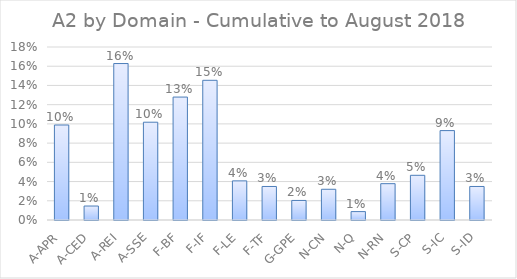
| Category | Series 0 |
|---|---|
| A-APR | 0.099 |
| A-CED | 0.015 |
| A-REI | 0.163 |
| A-SSE | 0.102 |
| F-BF | 0.128 |
| F-IF | 0.145 |
| F-LE | 0.041 |
| F-TF | 0.035 |
| G-GPE | 0.02 |
| N-CN | 0.032 |
| N-Q | 0.009 |
| N-RN | 0.038 |
| S-CP | 0.047 |
| S-IC | 0.093 |
| S-ID | 0.035 |